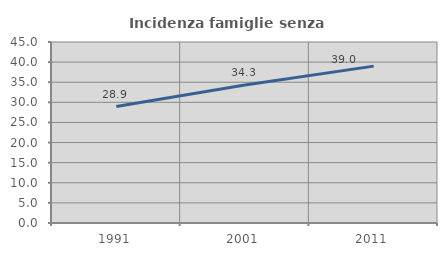
| Category | Incidenza famiglie senza nuclei |
|---|---|
| 1991.0 | 28.947 |
| 2001.0 | 34.292 |
| 2011.0 | 39 |